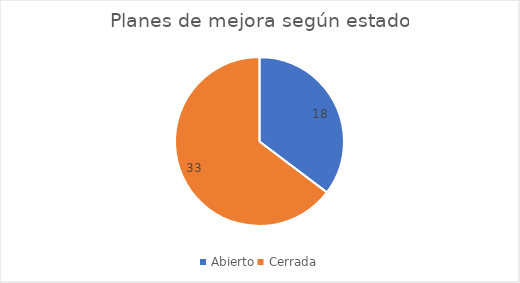
| Category | Series 0 |
|---|---|
| Abierto | 18 |
| Cerrada | 33 |